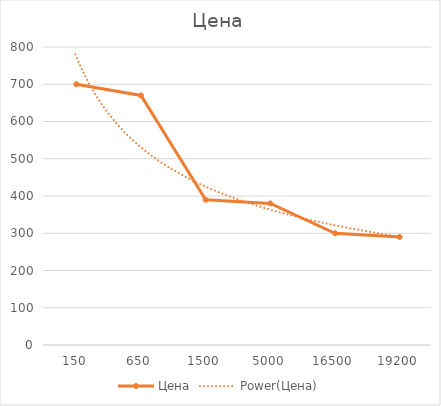
| Category | Цена |
|---|---|
| 150.0 | 700 |
| 650.0 | 670 |
| 1500.0 | 390 |
| 5000.0 | 380 |
| 16500.0 | 300 |
| 19200.0 | 290 |